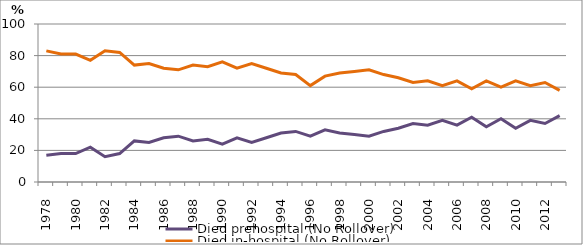
| Category | Died prehospital (No Rollover) | Died in-hospital (No Rollover) |
|---|---|---|
| 1978.0 | 17 | 83 |
| 1979.0 | 18 | 81 |
| 1980.0 | 18 | 81 |
| 1981.0 | 22 | 77 |
| 1982.0 | 16 | 83 |
| 1983.0 | 18 | 82 |
| 1984.0 | 26 | 74 |
| 1985.0 | 25 | 75 |
| 1986.0 | 28 | 72 |
| 1987.0 | 29 | 71 |
| 1988.0 | 26 | 74 |
| 1989.0 | 27 | 73 |
| 1990.0 | 24 | 76 |
| 1991.0 | 28 | 72 |
| 1992.0 | 25 | 75 |
| 1993.0 | 28 | 72 |
| 1994.0 | 31 | 69 |
| 1995.0 | 32 | 68 |
| 1996.0 | 29 | 61 |
| 1997.0 | 33 | 67 |
| 1998.0 | 31 | 69 |
| 1999.0 | 30 | 70 |
| 2000.0 | 29 | 71 |
| 2001.0 | 32 | 68 |
| 2002.0 | 34 | 66 |
| 2003.0 | 37 | 63 |
| 2004.0 | 36 | 64 |
| 2005.0 | 39 | 61 |
| 2006.0 | 36 | 64 |
| 2007.0 | 41 | 59 |
| 2008.0 | 35 | 64 |
| 2009.0 | 40 | 60 |
| 2010.0 | 34 | 64 |
| 2011.0 | 39 | 61 |
| 2012.0 | 37 | 63 |
| 2013.0 | 42 | 58 |